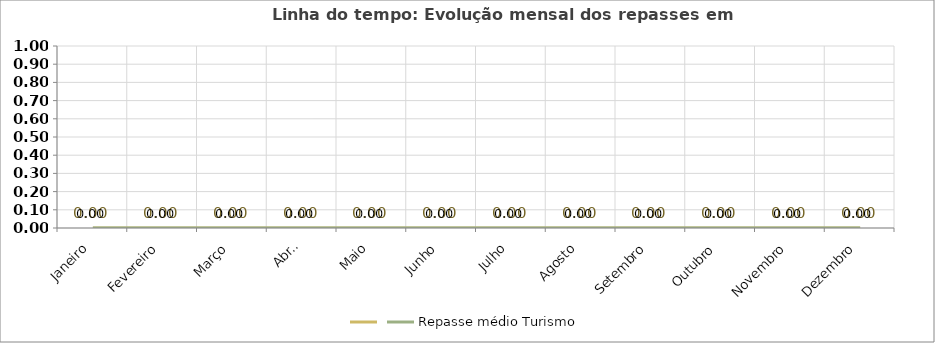
| Category | Series 0 | Repasse médio Turismo |
|---|---|---|
| Janeiro | 0 | 0 |
| Fevereiro | 0 | 0 |
| Março | 0 | 0 |
| Abril | 0 | 0 |
| Maio | 0 | 0 |
| Junho | 0 | 0 |
| Julho | 0 | 0 |
| Agosto | 0 | 0 |
| Setembro | 0 | 0 |
| Outubro | 0 | 0 |
| Novembro | 0 | 0 |
| Dezembro | 0 | 0 |